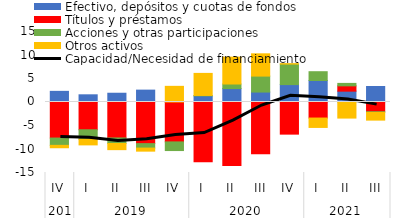
| Category |  Efectivo, depósitos y cuotas de fondos  |  Títulos y préstamos  |  Acciones y otras participaciones   |  Otros activos  |
|---|---|---|---|---|
| 0 | 2.266 | -7.67 | -1.551 | -0.514 |
| 1 | 1.53 | -5.906 | -2.012 | -1.207 |
| 2 | 1.864 | -7.649 | -1.175 | -1.314 |
| 3 | 2.526 | -8.858 | -0.947 | -0.65 |
| 4 | -0.059 | -8.431 | -1.841 | 3.331 |
| 5 | 1.299 | -12.706 | 0.092 | 4.694 |
| 6 | 2.86 | -13.522 | 0.968 | 5.72 |
| 7 | 2.116 | -11.006 | 3.395 | 4.741 |
| 8 | 3.702 | -6.837 | 4.361 | 0.088 |
| 9 | 4.574 | -3.415 | 1.872 | -1.996 |
| 10 | 2.307 | 1.129 | 0.521 | -3.421 |
| 11 | 3.298 | -2.069 | -0.136 | -1.651 |